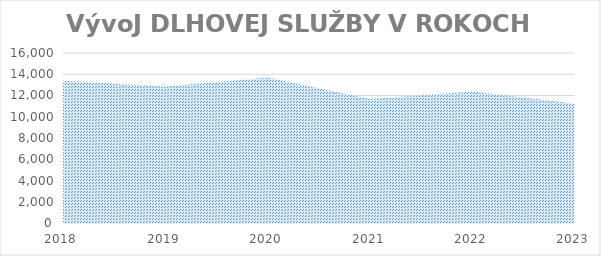
| Category | Series 0 |
|---|---|
| 2018.0 | 13381 |
| 2019.0 | 12837 |
| 2020.0 | 13686 |
| 2021.0 | 11680 |
| 2022.0 | 12374 |
| 2023.0 | 11244 |